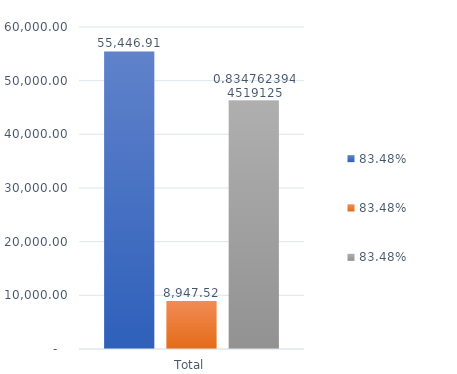
| Category | RESERVAS CONSTITUIDAS
 | CANCELACIONES RESERVAS PRESUPUESTALES
  | PAGOS
ACUMULADOS
 |
|---|---|---|---|
| Total | 55446.915 | 8947.524 | 46284.999 |